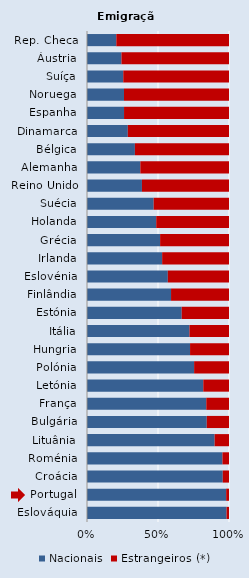
| Category | Nacionais | Estrangeiros (*) |
|---|---|---|
| Rep. Checa | 20.638 | 79.362 |
| Áustria | 24.266 | 75.734 |
| Suíça | 25.535 | 74.465 |
| Noruega | 26.054 | 73.946 |
| Espanha | 26.085 | 73.915 |
| Dinamarca | 28.737 | 71.263 |
| Bélgica | 33.736 | 66.264 |
| Alemanha | 37.56 | 62.44 |
| Reino Unido | 38.699 | 61.301 |
| Suécia | 46.95 | 53.05 |
| Holanda | 48.745 | 51.255 |
| Grécia | 51.496 | 48.504 |
| Irlanda | 52.924 | 47.076 |
| Eslovénia | 56.917 | 43.083 |
| Finlândia | 59.186 | 40.814 |
| Estónia | 66.692 | 33.308 |
| Itália | 72.165 | 27.835 |
| Hungria | 72.582 | 27.418 |
| Polónia | 75.433 | 24.567 |
| Letónia | 81.884 | 18.116 |
| França | 84 | 16 |
| Bulgária | 84.336 | 15.664 |
| Lituânia | 89.876 | 10.124 |
| Roménia | 95.382 | 4.618 |
| Croácia | 95.602 | 4.398 |
| Portugal | 98.011 | 1.989 |
| Eslováquia | 98.258 | 1.742 |